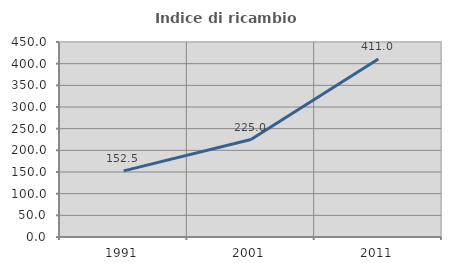
| Category | Indice di ricambio occupazionale  |
|---|---|
| 1991.0 | 152.5 |
| 2001.0 | 225 |
| 2011.0 | 410.976 |